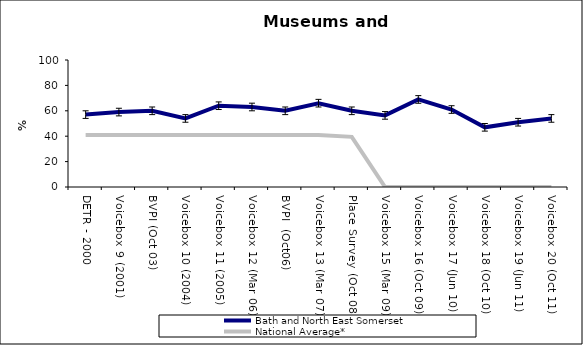
| Category | Bath and North East Somerset | National Average* |
|---|---|---|
| DETR - 2000 | 57 | 41 |
| Voicebox 9 (2001) | 59 | 41 |
| BVPI (Oct 03) | 60 | 41 |
| Voicebox 10 (2004) | 54 | 41 |
| Voicebox 11 (2005) | 64 | 41 |
| Voicebox 12 (Mar 06) | 63 | 41 |
| BVPI  (Oct06) | 60 | 41 |
| Voicebox 13 (Mar 07) | 66 | 41 |
| Place Survey (Oct 08) | 60 | 39.5 |
| Voicebox 15 (Mar 09) | 56.395 | 0 |
| Voicebox 16 (Oct 09) | 68.945 | 0 |
| Voicebox 17 (Jun 10) | 61 | 0 |
| Voicebox 18 (Oct 10) | 47 | 0 |
| Voicebox 19 (Jun 11) | 51 | 0 |
| Voicebox 20 (Oct 11) | 54 | 0 |